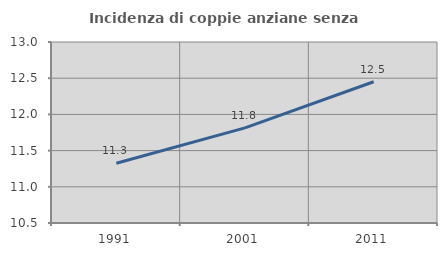
| Category | Incidenza di coppie anziane senza figli  |
|---|---|
| 1991.0 | 11.325 |
| 2001.0 | 11.814 |
| 2011.0 | 12.451 |